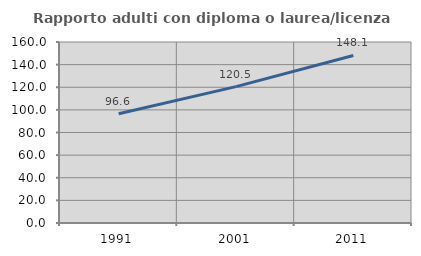
| Category | Rapporto adulti con diploma o laurea/licenza media  |
|---|---|
| 1991.0 | 96.573 |
| 2001.0 | 120.525 |
| 2011.0 | 148.125 |